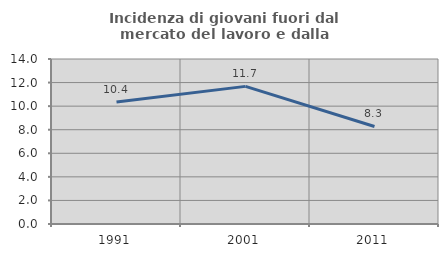
| Category | Incidenza di giovani fuori dal mercato del lavoro e dalla formazione  |
|---|---|
| 1991.0 | 10.359 |
| 2001.0 | 11.677 |
| 2011.0 | 8.273 |